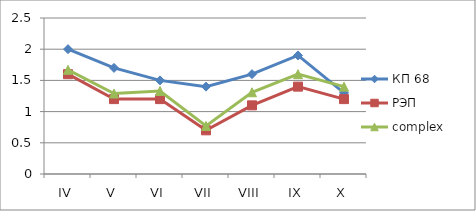
| Category | КП 68 | РЭП  | complex |
|---|---|---|---|
| IV | 2 | 1.6 | 1.67 |
| V | 1.7 | 1.2 | 1.29 |
| VI | 1.5 | 1.2 | 1.33 |
| VII | 1.4 | 0.7 | 0.77 |
| VIII | 1.6 | 1.1 | 1.31 |
| IX | 1.9 | 1.4 | 1.6 |
| X | 1.3 | 1.2 | 1.4 |